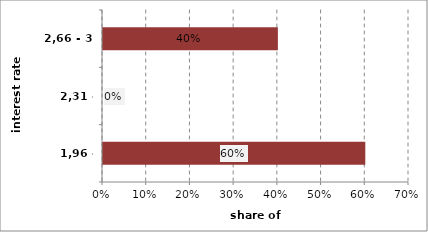
| Category | Series 0 |
|---|---|
| 1,96 - 2,31 | 0.6 |
| 2,31 - 2,66 | 0 |
| 2,66 - 3 | 0.4 |